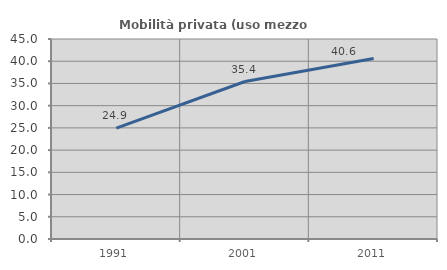
| Category | Mobilità privata (uso mezzo privato) |
|---|---|
| 1991.0 | 24.936 |
| 2001.0 | 35.437 |
| 2011.0 | 40.63 |